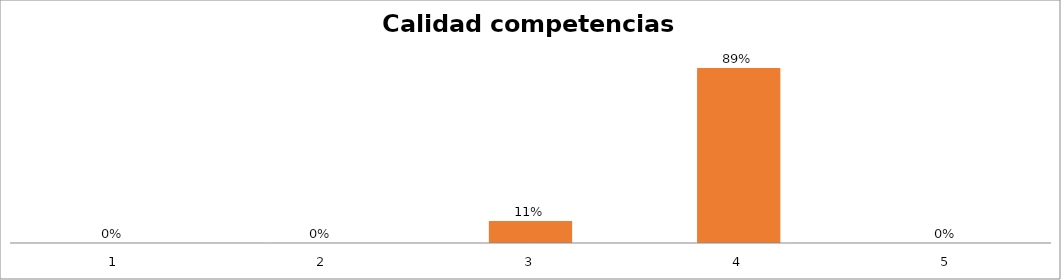
| Category | Series 1 |
|---|---|
| 0 | 0 |
| 1 | 0 |
| 2 | 0.111 |
| 3 | 0.889 |
| 4 | 0 |